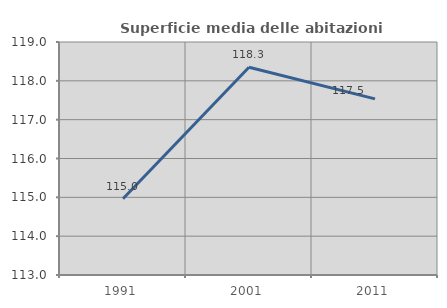
| Category | Superficie media delle abitazioni occupate |
|---|---|
| 1991.0 | 114.962 |
| 2001.0 | 118.348 |
| 2011.0 | 117.535 |